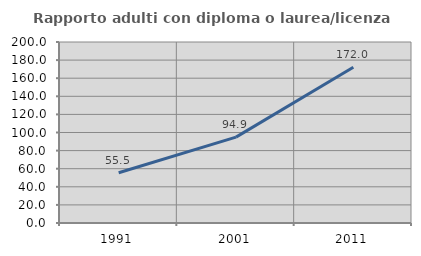
| Category | Rapporto adulti con diploma o laurea/licenza media  |
|---|---|
| 1991.0 | 55.519 |
| 2001.0 | 94.898 |
| 2011.0 | 172.036 |